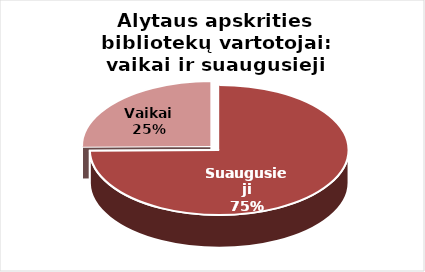
| Category | Series 0 |
|---|---|
| Suaugusieji | 27804 |
| Vaikai | 9351 |